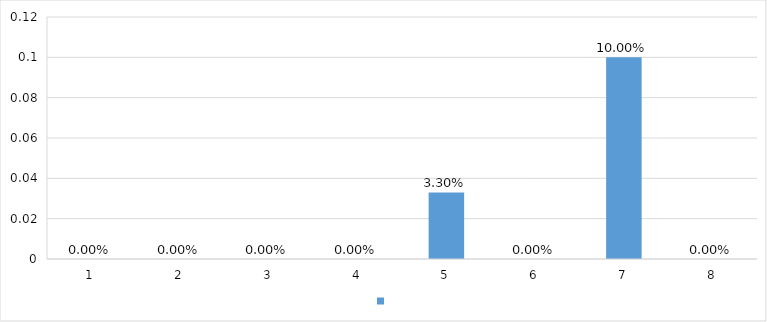
| Category | Series 0 |
|---|---|
| 1 | 0 |
| 2 | 0 |
| 3 | 0 |
| 4 | 0 |
| 5 | 0.033 |
| 6 | 0 |
| 7 | 0.1 |
| 8 | 0 |